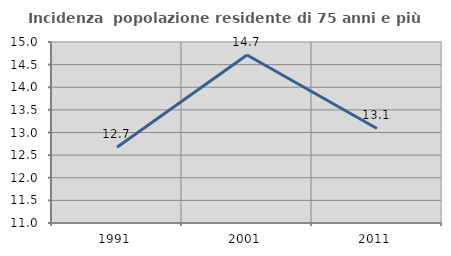
| Category | Incidenza  popolazione residente di 75 anni e più |
|---|---|
| 1991.0 | 12.675 |
| 2001.0 | 14.713 |
| 2011.0 | 13.089 |